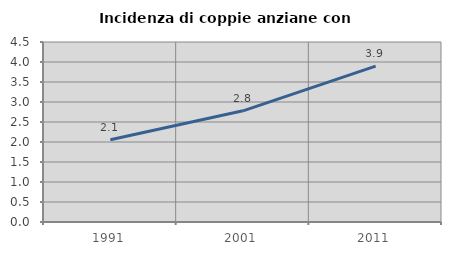
| Category | Incidenza di coppie anziane con figli |
|---|---|
| 1991.0 | 2.058 |
| 2001.0 | 2.78 |
| 2011.0 | 3.899 |